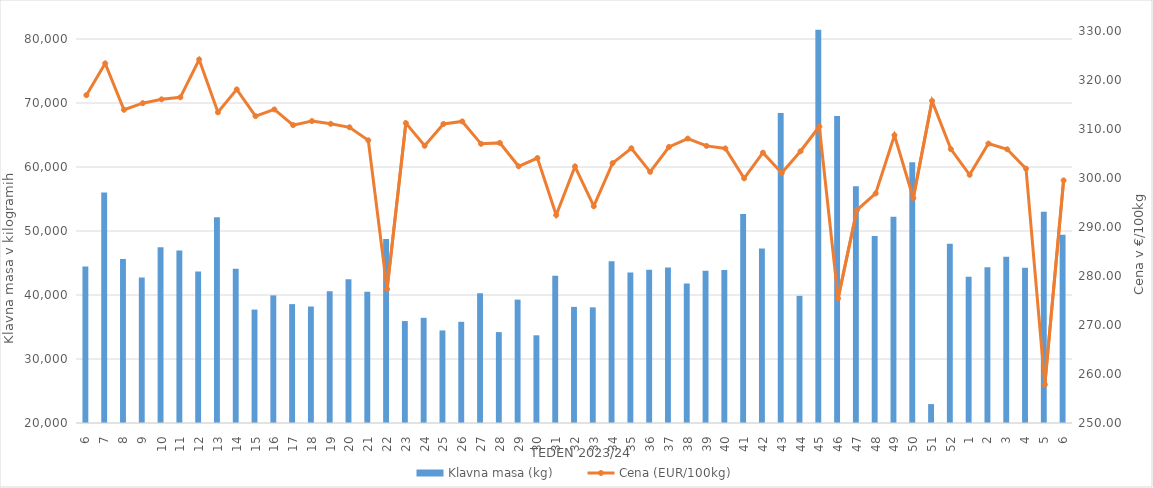
| Category | Klavna masa (kg) |
|---|---|
| 6.0 | 44439 |
| 7.0 | 56001 |
| 8.0 | 45613 |
| 9.0 | 42730 |
| 10.0 | 47471 |
| 11.0 | 46952 |
| 12.0 | 43683 |
| 13.0 | 52135 |
| 14.0 | 44103 |
| 15.0 | 37719 |
| 16.0 | 39943 |
| 17.0 | 38574 |
| 18.0 | 38200 |
| 19.0 | 40581 |
| 20.0 | 42443 |
| 21.0 | 40517 |
| 22.0 | 48742 |
| 23.0 | 35927 |
| 24.0 | 36436 |
| 25.0 | 34463 |
| 26.0 | 35812 |
| 27.0 | 40280 |
| 28.0 | 34201 |
| 29.0 | 39279 |
| 30.0 | 33702 |
| 31.0 | 43020 |
| 32.0 | 38146 |
| 33.0 | 38070 |
| 34.0 | 45290 |
| 35.0 | 43513 |
| 36.0 | 43945 |
| 37.0 | 44302 |
| 38.0 | 41798 |
| 39.0 | 43790 |
| 40.0 | 43913 |
| 41.0 | 52663 |
| 42.0 | 47275 |
| 43.0 | 68419 |
| 44.0 | 39872 |
| 45.0 | 81439 |
| 46.0 | 67983 |
| 47.0 | 57006 |
| 48.0 | 49204 |
| 49.0 | 52219 |
| 50.0 | 60759 |
| 51.0 | 22954 |
| 52.0 | 48002 |
| 1.0 | 42866 |
| 2.0 | 44318 |
| 3.0 | 45969 |
| 4.0 | 44266 |
| 5.0 | 52991 |
| 6.0 | 49406 |